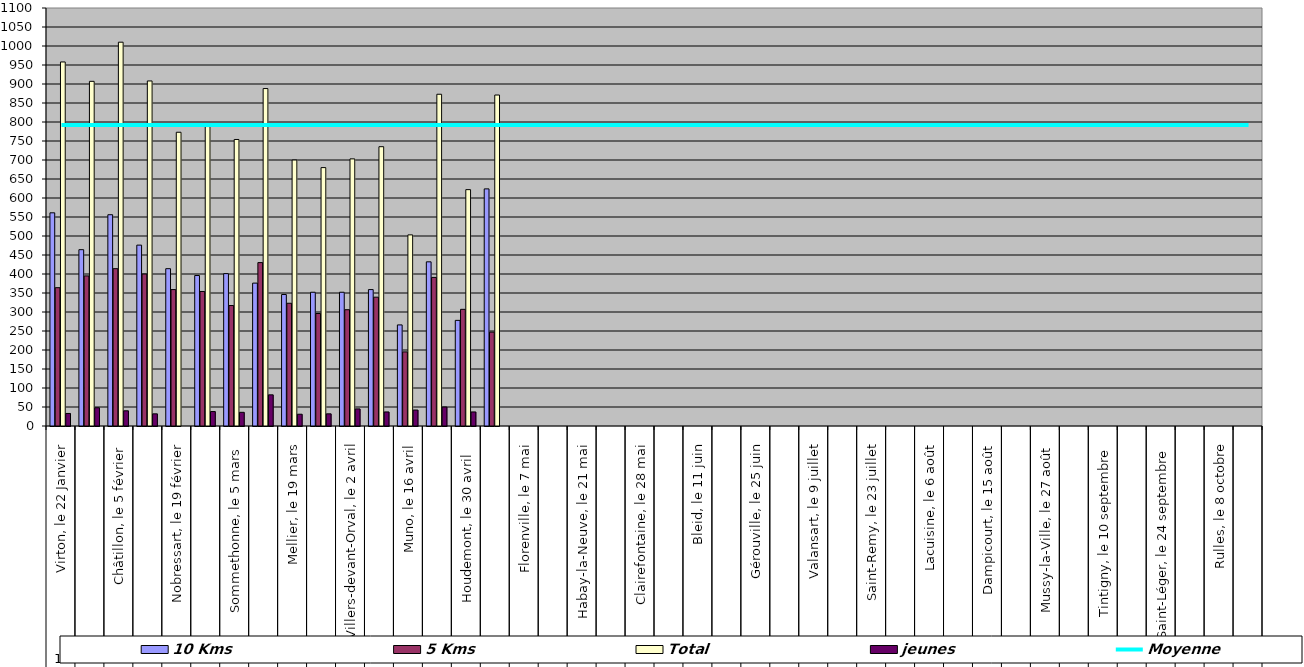
| Category | 10 Kms | 5 Kms | Total | jeunes |
|---|---|---|---|---|
| 0 | 561 | 364 | 958 | 33 |
| 1 | 464 | 395 | 907 | 48 |
| 2 | 556 | 414 | 1010 | 40 |
| 3 | 476 | 400 | 908 | 32 |
| 4 | 414 | 359 | 773 | 0 |
| 5 | 396 | 354 | 788 | 38 |
| 6 | 401 | 317 | 754 | 36 |
| 7 | 376 | 430 | 888 | 82 |
| 8 | 346 | 323 | 700 | 31 |
| 9 | 352 | 296 | 680 | 32 |
| 10 | 352 | 306 | 703 | 45 |
| 11 | 359 | 339 | 735 | 37 |
| 12 | 266 | 195 | 503 | 42 |
| 13 | 432 | 391 | 873 | 50 |
| 14 | 278 | 307 | 622 | 37 |
| 15 | 624 | 247 | 871 | 0 |
| 16 | 0 | 0 | 0 | 0 |
| 17 | 0 | 0 | 0 | 0 |
| 18 | 0 | 0 | 0 | 0 |
| 19 | 0 | 0 | 0 | 0 |
| 20 | 0 | 0 | 0 | 0 |
| 21 | 0 | 0 | 0 | 0 |
| 22 | 0 | 0 | 0 | 0 |
| 23 | 0 | 0 | 0 | 0 |
| 24 | 0 | 0 | 0 | 0 |
| 25 | 0 | 0 | 0 | 0 |
| 26 | 0 | 0 | 0 | 0 |
| 27 | 0 | 0 | 0 | 0 |
| 28 | 0 | 0 | 0 | 0 |
| 29 | 0 | 0 | 0 | 0 |
| 30 | 0 | 0 | 0 | 0 |
| 31 | 0 | 0 | 0 | 0 |
| 32 | 0 | 0 | 0 | 0 |
| 33 | 0 | 0 | 0 | 0 |
| 34 | 0 | 0 | 0 | 0 |
| 35 | 0 | 0 | 0 | 0 |
| 36 | 0 | 0 | 0 | 0 |
| 37 | 0 | 0 | 0 | 0 |
| 38 | 0 | 0 | 0 | 0 |
| 39 | 0 | 0 | 0 | 0 |
| 40 | 0 | 0 | 0 | 0 |
| 41 | 0 | 0 | 0 | 0 |